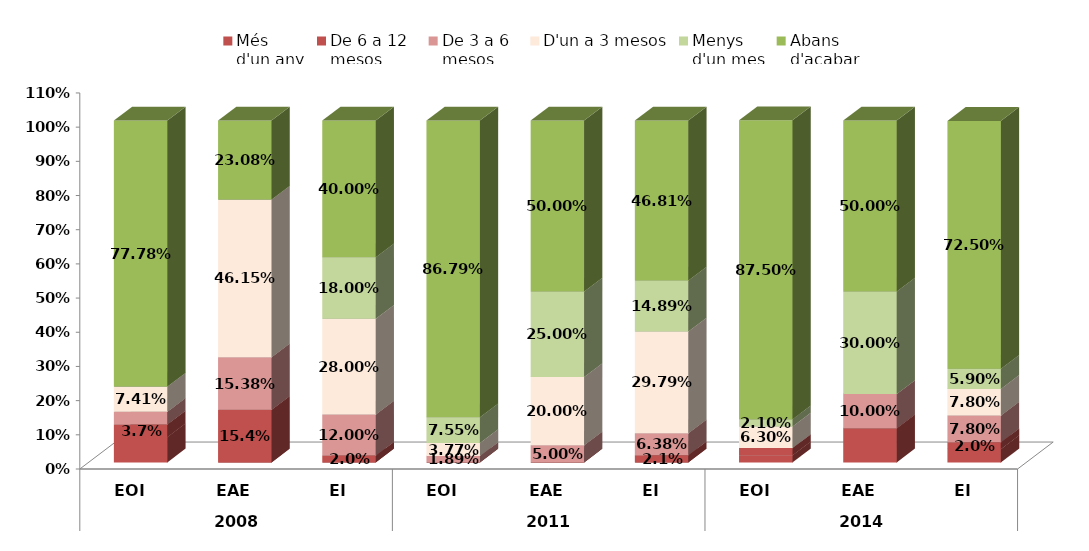
| Category | Més
d'un any | De 6 a 12
mesos | De 3 a 6
mesos | D'un a 3 mesos | Menys
d'un mes | Abans
d'acabar |
|---|---|---|---|---|---|---|
| 0 | 0.074 | 0.037 | 0.037 | 0.074 | 0 | 0.778 |
| 1 | 0 | 0.154 | 0.154 | 0.462 | 0 | 0.231 |
| 2 | 0 | 0.02 | 0.12 | 0.28 | 0.18 | 0.4 |
| 3 | 0 | 0 | 0.019 | 0.038 | 0.076 | 0.868 |
| 4 | 0 | 0 | 0.05 | 0.2 | 0.25 | 0.5 |
| 5 | 0 | 0.021 | 0.064 | 0.298 | 0.149 | 0.468 |
| 6 | 0.021 | 0.021 | 0 | 0.063 | 0.021 | 0.875 |
| 7 | 0.1 | 0 | 0.1 | 0 | 0.3 | 0.5 |
| 8 | 0.039 | 0.02 | 0.078 | 0.078 | 0.059 | 0.725 |